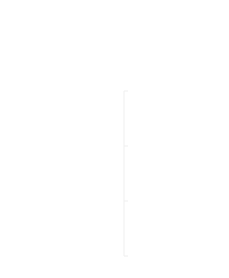
| Category | חיובי | שלילי |
|---|---|---|
| 0 | 0 | 0 |
| 1 | 0 | 0 |
| 2 | 0 | 0 |